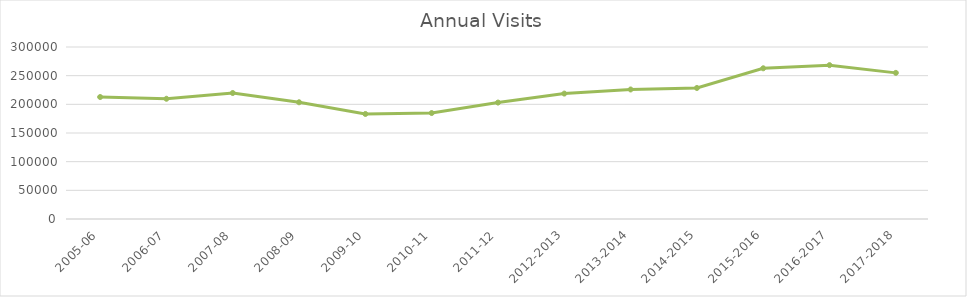
| Category | Series 0 |
|---|---|
| 2005-06 | 212770 |
| 2006-07 | 209725 |
| 2007-08 | 219750 |
| 2008-09 | 203589 |
| 2009-10 | 183186 |
| 2010-11 | 184812 |
| 2011-12 | 203074 |
| 2012-2013 | 218745 |
| 2013-2014 | 225912 |
| 2014-2015 | 228538 |
| 2015-2016 | 262865 |
| 2016-2017 | 268347 |
| 2017-2018 | 254873 |